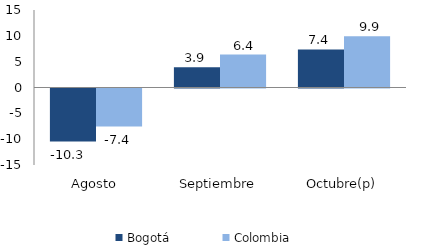
| Category | Bogotá | Colombia |
|---|---|---|
| Agosto | -10.259 | -7.371 |
| Septiembre | 3.908 | 6.363 |
| Octubre(p) | 7.371 | 9.923 |